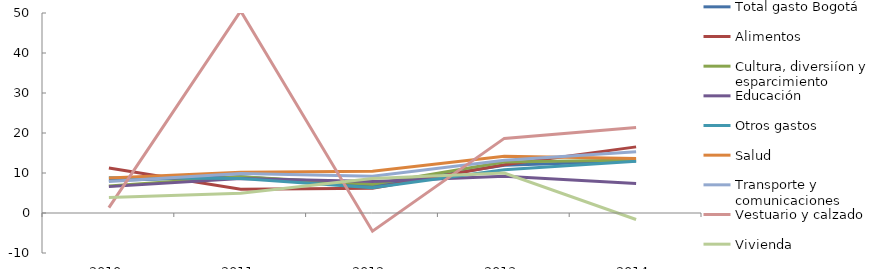
| Category | Total gasto Bogotá | Alimentos | Cultura, diversiíon y esparcimiento | Educación | Otros gastos | Salud | Transporte y comunicaciones | Vestuario y calzado | Vivienda |
|---|---|---|---|---|---|---|---|---|---|
| 2010.0 | 8.144 | 11.245 | 6.76 | 6.594 | 8.792 | 8.731 | 7.845 | 1.351 | 3.874 |
| 2011.0 | 9.069 | 5.928 | 9.06 | 8.621 | 8.645 | 10.192 | 9.845 | 50.495 | 4.93 |
| 2012.0 | 6.819 | 6.212 | 7.2 | 7.893 | 6.293 | 10.453 | 9.164 | -4.541 | 8.637 |
| 2013.0 | 11.941 | 12.061 | 12.738 | 9.172 | 10.788 | 14.191 | 13.173 | 18.653 | 9.972 |
| 2014.0 | 13.027 | 16.534 | 13.253 | 7.398 | 12.953 | 13.638 | 15.303 | 21.365 | -1.621 |